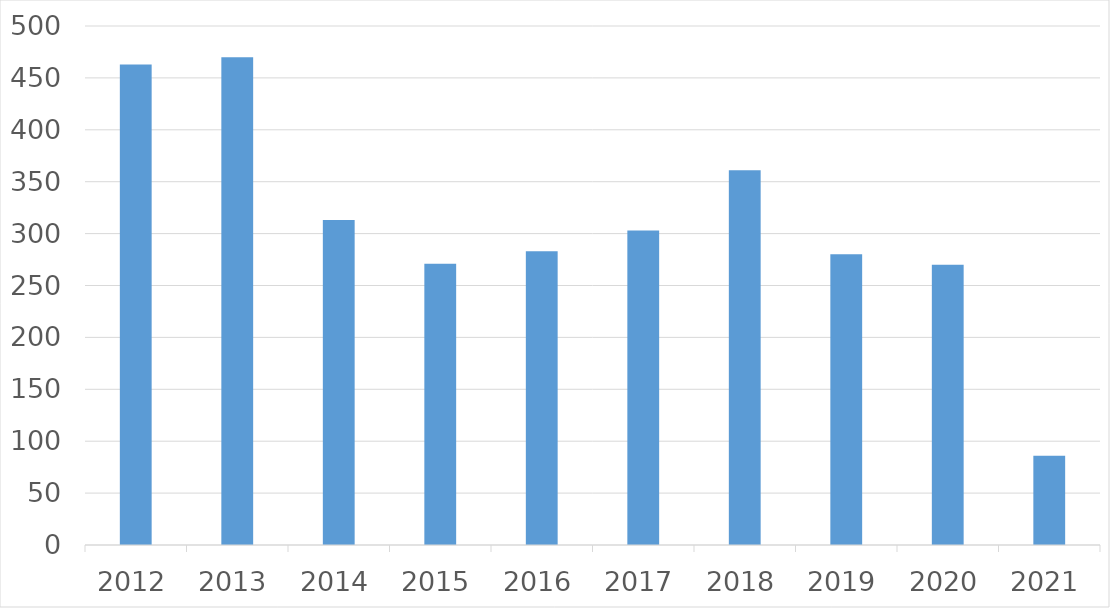
| Category | Series 0 |
|---|---|
| 2012 | 463 |
| 2013 | 470 |
| 2014 | 313 |
| 2015 | 271 |
| 2016 | 283 |
| 2017 | 303 |
| 2018 | 361 |
| 2019 | 280 |
| 2020 | 270 |
| 2021 | 86 |